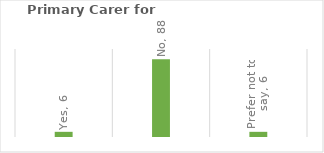
| Category | % |
|---|---|
| Yes | 5.882 |
| No | 88.235 |
| Prefer not to say | 5.882 |